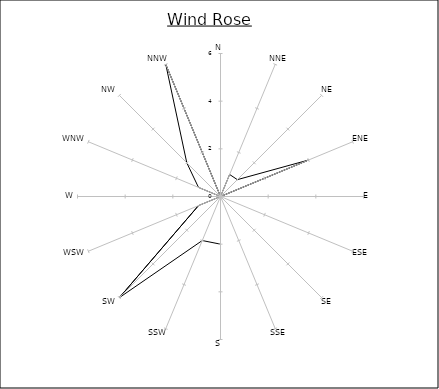
| Category | Series 0 |
|---|---|
| N | 0 |
| NNE | 1 |
| NE | 1 |
| ENE | 4 |
| E | 0 |
| ESE | 0 |
| SE | 0 |
| SSE | 0 |
| S | 2 |
| SSW | 2 |
| SW | 6 |
| WSW | 1 |
| W | 0 |
| WNW | 1 |
| NW | 2 |
| NNW | 6 |